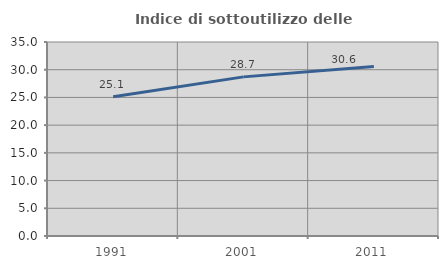
| Category | Indice di sottoutilizzo delle abitazioni  |
|---|---|
| 1991.0 | 25.134 |
| 2001.0 | 28.709 |
| 2011.0 | 30.559 |